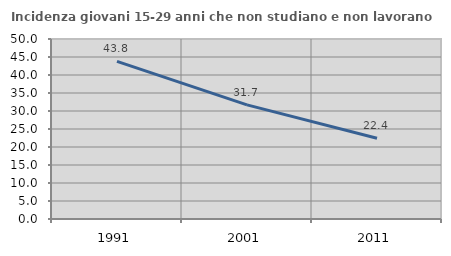
| Category | Incidenza giovani 15-29 anni che non studiano e non lavorano  |
|---|---|
| 1991.0 | 43.801 |
| 2001.0 | 31.695 |
| 2011.0 | 22.412 |